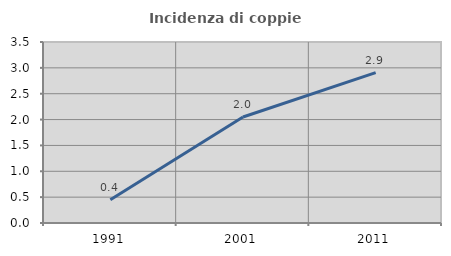
| Category | Incidenza di coppie miste |
|---|---|
| 1991.0 | 0.448 |
| 2001.0 | 2.049 |
| 2011.0 | 2.909 |